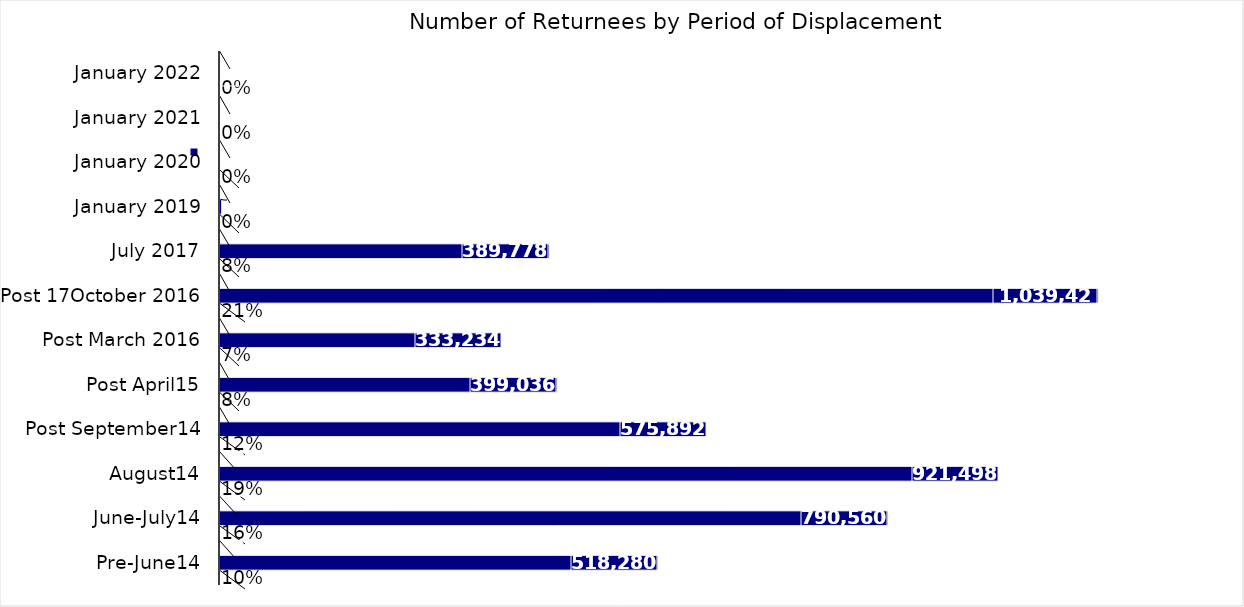
| Category | Sum of % | Sum of Returnees Individuals  | Sum of rank |
|---|---|---|---|
| Pre-June14 | 0.104 | 518280 | 12 |
| June-July14 | 0.159 | 790560 | 11 |
| August14 | 0.185 | 921498 | 10 |
| Post September14 | 0.116 | 575892 | 9 |
| Post April15 | 0.08 | 399036 | 8 |
| Post March 2016 | 0.067 | 333234 | 7 |
| Post 17October 2016 | 0.209 | 1039422 | 6 |
| July 2017 | 0.078 | 389778 | 5 |
| January 2019 | 0 | 2034 | 4 |
| January 2020 | 0 | 54 | 3 |
| January 2021 | 0 | 0 | 2 |
| January 2022 | 0 | 0 | 1 |